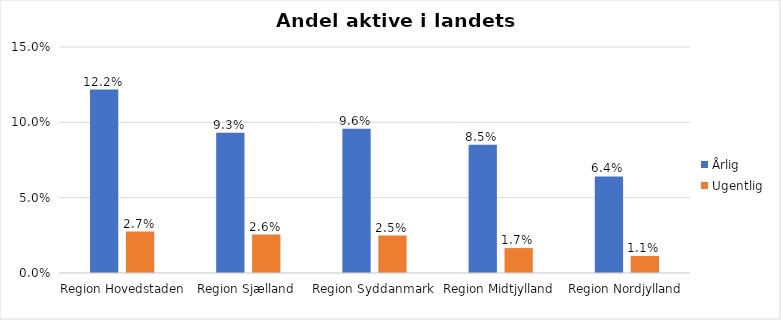
| Category | Årlig | Ugentlig |
|---|---|---|
| Region Hovedstaden | 0.122 | 0.027 |
| Region Sjælland | 0.093 | 0.026 |
| Region Syddanmark | 0.096 | 0.025 |
| Region Midtjylland | 0.085 | 0.017 |
| Region Nordjylland | 0.064 | 0.011 |